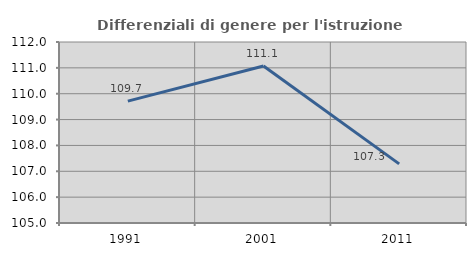
| Category | Differenziali di genere per l'istruzione superiore |
|---|---|
| 1991.0 | 109.712 |
| 2001.0 | 111.071 |
| 2011.0 | 107.286 |